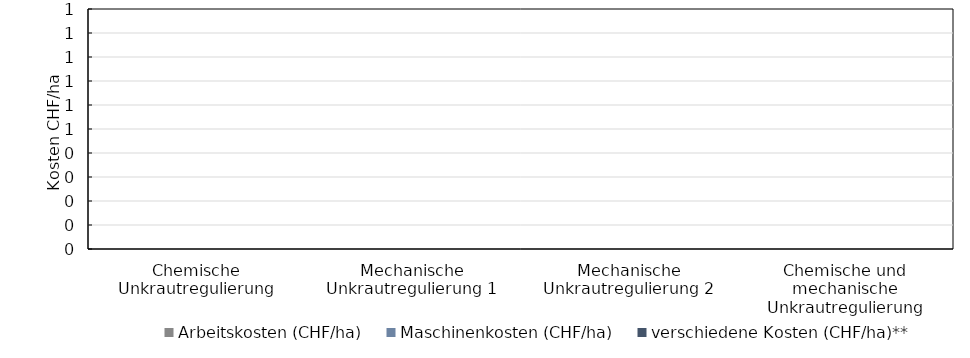
| Category | Arbeitskosten (CHF/ha) | Maschinenkosten (CHF/ha) | verschiedene Kosten (CHF/ha)** |
|---|---|---|---|
| Chemische Unkrautregulierung | 0 | 0 | 0 |
| Mechanische Unkrautregulierung 1 | 0 | 0 | 0 |
| Mechanische Unkrautregulierung 2 | 0 | 0 | 0 |
| Chemische und mechanische Unkrautregulierung | 0 | 0 | 0 |